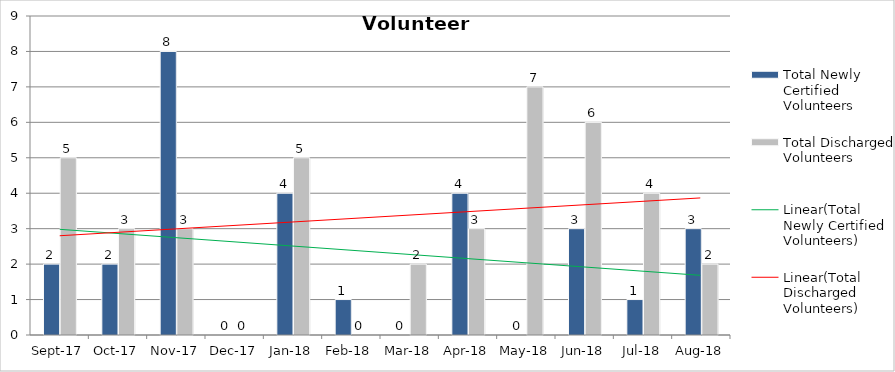
| Category | Total Newly Certified Volunteers | Total Discharged Volunteers |
|---|---|---|
| 2017-09-01 | 2 | 5 |
| 2017-10-01 | 2 | 3 |
| 2017-11-01 | 8 | 3 |
| 2017-12-01 | 0 | 0 |
| 2018-01-01 | 4 | 5 |
| 2018-02-01 | 1 | 0 |
| 2018-03-01 | 0 | 2 |
| 2018-04-01 | 4 | 3 |
| 2018-05-01 | 0 | 7 |
| 2018-06-01 | 3 | 6 |
| 2018-07-01 | 1 | 4 |
| 2018-08-01 | 3 | 2 |